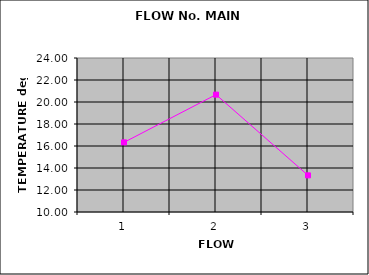
| Category | Temp (C) |
|---|---|
| 0 | 16.33 |
| 1 | 20.67 |
| 2 | 13.33 |